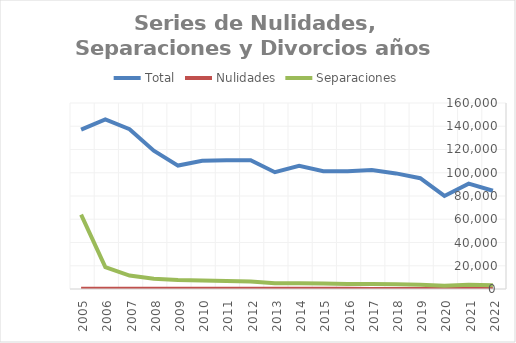
| Category | Total | Nulidades | Separaciones |
|---|---|---|---|
| 2022 | 84551 | 39 | 3210 |
| 2021 | 90582 | 57 | 3674 |
| 2020 | 80015 | 40 | 2775 |
| 2019 | 95320 | 75 | 3599 |
| 2018 | 99444 | 92 | 4098 |
| 2017 | 102341 | 100 | 4280 |
| 2016 | 101294 | 117 | 4353 |
| 2015 | 101357 | 144 | 4652 |
| 2014 | 105893 | 113 | 5034 |
| 2013 | 100437 | 110 | 4900 |
| 2012 | 110764 | 133 | 6369 |
| 2011 | 110651 | 132 | 6915 |
| 2010 | 110321 | 140 | 7248 |
| 2009 | 106166 | 127 | 7680 |
| 2008 | 118939 | 142 | 8761 |
| 2007 | 137510 | 150 | 11583 |
| 2006 | 145919 | 174 | 18793 |
| 2005 | 137044 | 168 | 64028 |